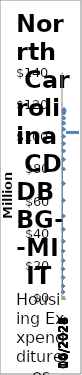
| Category | Projected Expenditures | Actual Expenditure |
|---|---|---|
| 10/2022 | 3750000 | 0 |
| 01/2023 | 7500000 | 0 |
| 04/2023 | 12750000 | 0 |
| 07/2023 | 18000000 | 0 |
| 10/2023 | 23250000 | 0 |
| 01/2024 | 29250000 | 0 |
| 04/2024 | 35250000 | 0 |
| 07/2024 | 42750000 | 0 |
| 10/2024 | 51000000 | 0 |
| 01/2025 | 60750000 | 0 |
| 04/2025 | 71250000 | 0 |
| 07/2025 | 80250000 | 0 |
| 10/2025 | 86250000 | 0 |
| 01/2026 | 91500000 | 0 |
| 04/2026 | 96000000 | 0 |
| 07/2026 | 100500000 | 0 |
| 10/2026 | 105000000 | 0 |
| 01/2027 | 108750000 | 0 |
| 04/2027 | 111900000 | 0 |
| 07/2027 | 115050000 | 0 |
| 10/2027 | 115950000 | 0 |
| 01/2028 | 116700000 | 0 |
| 04/2028 | 117000000 | 0 |
| 07/2028 | 117300000 | 0 |